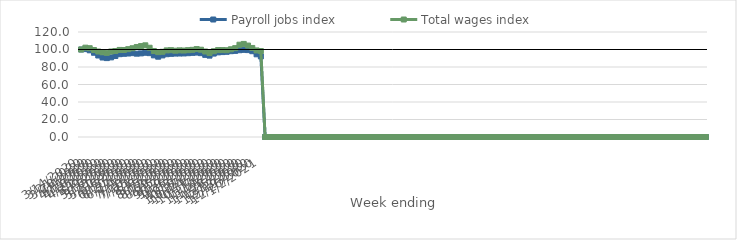
| Category | Payroll jobs index | Total wages index |
|---|---|---|
| 14/03/2020 | 100 | 100 |
| 21/03/2020 | 100.446 | 102.097 |
| 28/03/2020 | 99.083 | 101.486 |
| 04/04/2020 | 96.28 | 99.408 |
| 11/04/2020 | 93.138 | 97.701 |
| 18/04/2020 | 90.835 | 96.818 |
| 25/04/2020 | 90.166 | 96.15 |
| 02/05/2020 | 91.005 | 97.726 |
| 09/05/2020 | 92.577 | 98.274 |
| 16/05/2020 | 94.644 | 99.514 |
| 23/05/2020 | 95.083 | 99.436 |
| 30/05/2020 | 95.394 | 100.378 |
| 06/06/2020 | 95.834 | 101.43 |
| 13/06/2020 | 95.233 | 102.874 |
| 20/06/2020 | 95.558 | 103.919 |
| 27/06/2020 | 96.255 | 104.776 |
| 04/07/2020 | 95.829 | 102.017 |
| 11/07/2020 | 93.29 | 98.31 |
| 18/07/2020 | 91.756 | 96.972 |
| 25/07/2020 | 93.236 | 97.385 |
| 01/08/2020 | 94.624 | 98.993 |
| 08/08/2020 | 95.045 | 99.223 |
| 15/08/2020 | 95.352 | 98.633 |
| 22/08/2020 | 95.424 | 99.028 |
| 29/08/2020 | 95.486 | 98.808 |
| 05/09/2020 | 95.771 | 99.238 |
| 12/09/2020 | 96.154 | 99.619 |
| 19/09/2020 | 96.483 | 100.496 |
| 26/09/2020 | 95.815 | 99.748 |
| 03/10/2020 | 93.852 | 97.722 |
| 10/10/2020 | 93.009 | 95.972 |
| 17/10/2020 | 95.333 | 98.019 |
| 24/10/2020 | 96.705 | 99.315 |
| 31/10/2020 | 97.043 | 99.334 |
| 07/11/2020 | 97.349 | 99.186 |
| 14/11/2020 | 98.066 | 100.265 |
| 21/11/2020 | 98.412 | 101.554 |
| 28/11/2020 | 99.168 | 105.469 |
| 05/12/2020 | 99.57 | 106.364 |
| 12/12/2020 | 99.312 | 104.515 |
| 19/12/2020 | 98.044 | 101.753 |
| 26/12/2020 | 94.516 | 98.953 |
| 02/01/2021 | 92.08 | 98.232 |